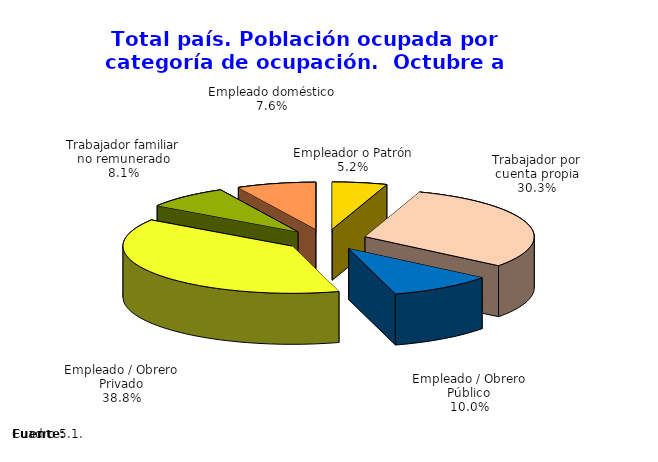
| Category | Series 0 |
|---|---|
| Empleador o Patrón | 5.229 |
| Trabajador por cuenta propia | 30.303 |
| Empleado / Obrero Público | 10.009 |
| Empleado / Obrero Privado | 38.809 |
| Trabajador familiar no remunerado | 8.085 |
| Empleado doméstico | 7.565 |